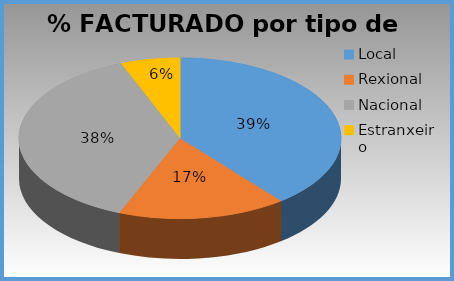
| Category | % facturado |
|---|---|
| Local | 0.392 |
| Rexional | 0.169 |
| Nacional | 0.379 |
| Estranxeiro | 0.06 |